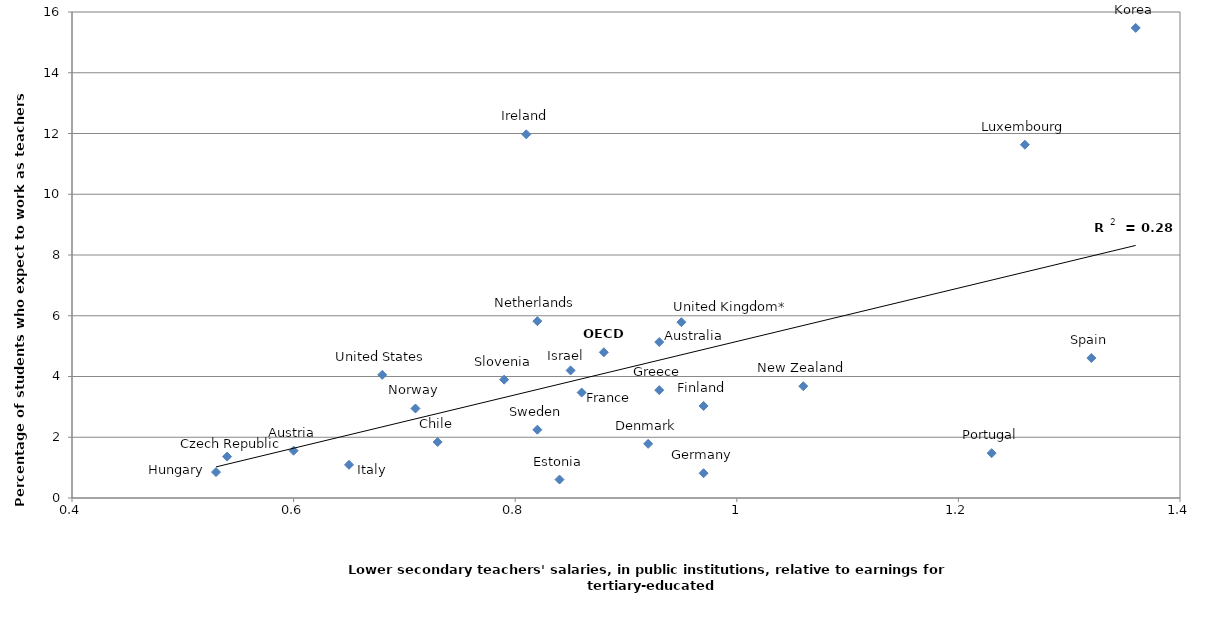
| Category | Series 0 |
|---|---|
| 0.73 | 1.843 |
| 1.32 | 4.608 |
| 0.68 | 4.054 |
| 0.93 | 3.551 |
| 0.81 | 11.974 |
| 1.36 | 15.476 |
| 0.85 | 4.2 |
| 0.65 | 1.093 |
| 1.23 | 1.476 |
| 0.79 | 3.896 |
| 1.26 | 11.632 |
| 0.93 | 5.135 |
| 0.88 | 4.797 |
| 0.71 | 2.947 |
| 1.06 | 3.68 |
| 0.84 | 0.608 |
| 0.86 | 3.471 |
| 0.53 | 0.854 |
| 0.97 | 3.03 |
| 0.82 | 5.822 |
| 0.92 | 1.783 |
| 0.82 | 2.248 |
| 0.54 | 1.363 |
| 0.97 | 0.816 |
| 0.95 | 5.789 |
| 0.6 | 1.557 |